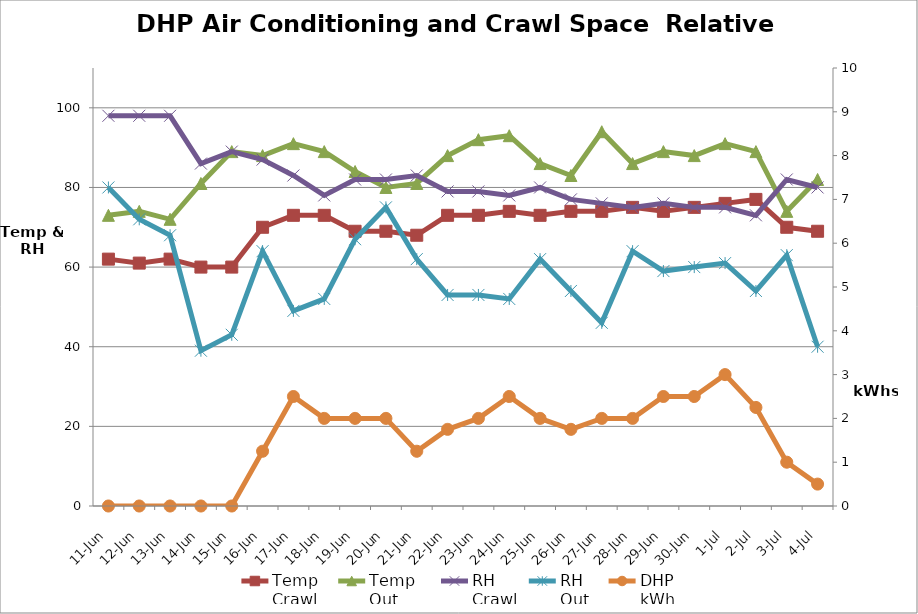
| Category | Temp
Crawl | Temp 
Out | RH
Crawl | RH 
Out |
|---|---|---|---|---|
| 2014-06-11 | 62 | 73 | 98 | 80 |
| 2014-06-12 | 61 | 74 | 98 | 72 |
| 2014-06-13 | 62 | 72 | 98 | 68 |
| 2014-06-14 | 60 | 81 | 86 | 39 |
| 2014-06-15 | 60 | 89 | 89 | 43 |
| 2014-06-16 | 70 | 88 | 87 | 64 |
| 2014-06-17 | 73 | 91 | 83 | 49 |
| 2014-06-18 | 73 | 89 | 78 | 52 |
| 2014-06-19 | 69 | 84 | 82 | 67 |
| 2014-06-20 | 69 | 80 | 82 | 75 |
| 2014-06-21 | 68 | 81 | 83 | 62 |
| 2014-06-22 | 73 | 88 | 79 | 53 |
| 2014-06-23 | 73 | 92 | 79 | 53 |
| 2014-06-24 | 74 | 93 | 78 | 52 |
| 2014-06-25 | 73 | 86 | 80 | 62 |
| 2014-06-26 | 74 | 83 | 77 | 54 |
| 2014-06-27 | 74 | 94 | 76 | 46 |
| 2014-06-28 | 75 | 86 | 75 | 64 |
| 2014-06-29 | 74 | 89 | 76 | 59 |
| 2014-06-30 | 75 | 88 | 75 | 60 |
| 2014-07-01 | 76 | 91 | 75 | 61 |
| 2014-07-02 | 77 | 89 | 73 | 54 |
| 2014-07-03 | 70 | 74 | 82 | 63 |
| 2014-07-04 | 69 | 82 | 80 | 40 |